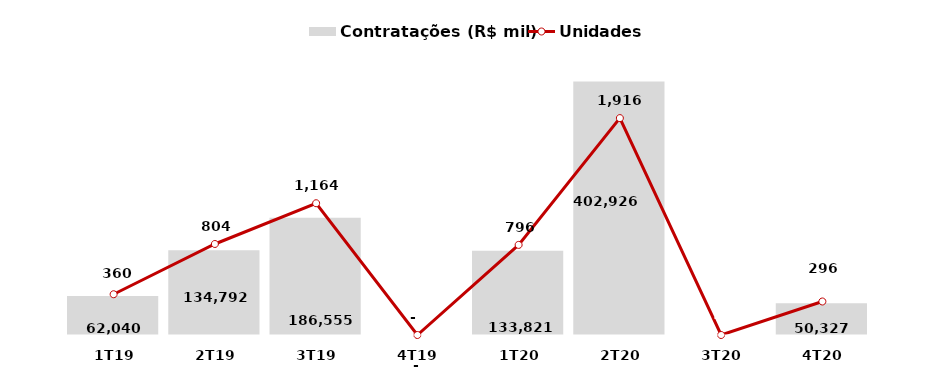
| Category | Contratações (R$ mil) |
|---|---|
| 1T19 | 62040 |
| 2T19 | 134791.6 |
| 3T19 | 186555.4 |
| 4T19 | 0 |
| 1T20 | 133821.2 |
| 2T20 | 402925.5 |
| 3T20 | 0 |
| 4T20 | 50327 |